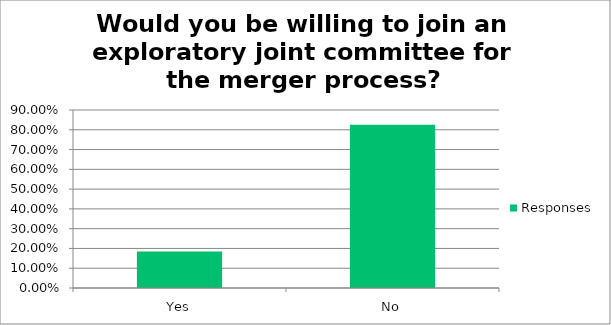
| Category | Responses |
|---|---|
| Yes | 0.184 |
| No | 0.825 |